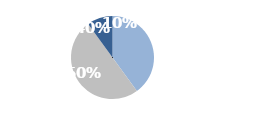
| Category | Series 0 |
|---|---|
| Store | 40 |
| Online | 50 |
| Mail | 10 |